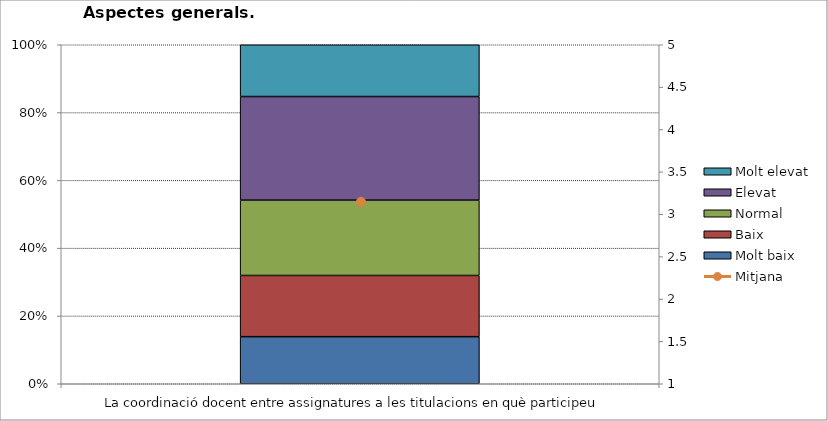
| Category | Molt baix | Baix | Normal  | Elevat | Molt elevat |
|---|---|---|---|---|---|
| La coordinació docent entre assignatures a les titulacions en què participeu | 10 | 13 | 16 | 22 | 11 |